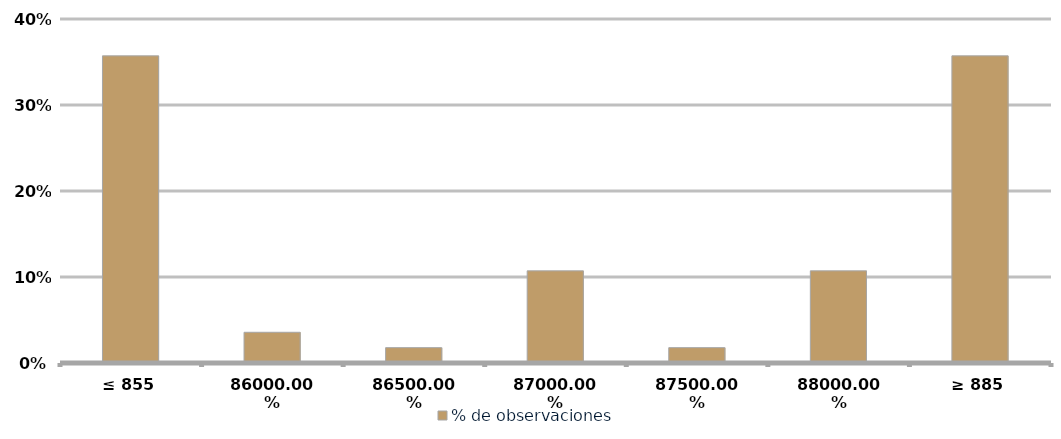
| Category | % de observaciones  |
|---|---|
| ≤ 855 | 0.357 |
| 860 | 0.036 |
| 865 | 0.018 |
| 870 | 0.107 |
| 875 | 0.018 |
| 880 | 0.107 |
| ≥ 885 | 0.357 |